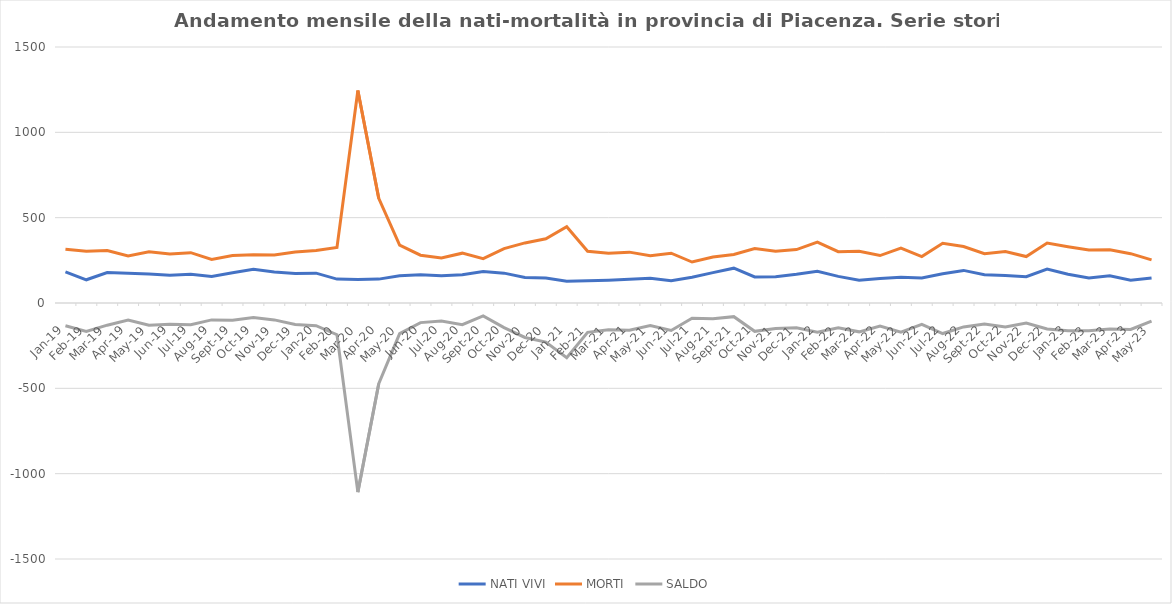
| Category | NATI VIVI | MORTI | SALDO |
|---|---|---|---|
| 2019-01-01 | 182 | 315 | -133 |
| 2019-02-01 | 136 | 303 | -167 |
| 2019-03-01 | 178 | 308 | -130 |
| 2019-04-01 | 175 | 275 | -100 |
| 2019-05-01 | 170 | 300 | -130 |
| 2019-06-01 | 163 | 287 | -124 |
| 2019-07-01 | 168 | 295 | -127 |
| 2019-08-01 | 156 | 255 | -99 |
| 2019-09-01 | 177 | 278 | -101 |
| 2019-10-01 | 198 | 283 | -85 |
| 2019-11-01 | 182 | 281 | -99 |
| 2019-12-01 | 173 | 299 | -126 |
| 2020-01-01 | 175 | 308 | -133 |
| 2020-02-01 | 140 | 326 | -186 |
| 2020-03-01 | 137 | 1245 | -1108 |
| 2020-04-01 | 140 | 613 | -473 |
| 2020-05-01 | 160 | 339 | -179 |
| 2020-06-01 | 165 | 280 | -115 |
| 2020-07-01 | 159 | 264 | -105 |
| 2020-08-01 | 165 | 292 | -127 |
| 2020-09-01 | 184 | 260 | -76 |
| 2020-10-01 | 175 | 319 | -144 |
| 2020-11-01 | 150 | 352 | -202 |
| 2020-12-01 | 147 | 376 | -229 |
| 2021-01-01 | 127 | 447 | -320 |
| 2021-02-01 | 131 | 303 | -172 |
| 2021-03-01 | 134 | 291 | -157 |
| 2021-04-01 | 139 | 298 | -159 |
| 2021-05-01 | 145 | 277 | -132 |
| 2021-06-01 | 131 | 292 | -161 |
| 2021-07-01 | 151 | 240 | -89 |
| 2021-08-01 | 178 | 270 | -92 |
| 2021-09-01 | 204 | 284 | -80 |
| 2021-10-01 | 153 | 319 | -166 |
| 2021-11-01 | 154 | 303 | -149 |
| 2021-12-01 | 168 | 313 | -145 |
| 2022-01-01 | 186 | 357 | -171 |
| 2022-02-01 | 156 | 301 | -145 |
| 2022-03-01 | 134 | 303 | -169 |
| 2022-04-01 | 143 | 278 | -135 |
| 2022-05-01 | 151 | 322 | -171 |
| 2022-06-01 | 147 | 272 | -125 |
| 2022-07-01 | 171 | 350 | -179 |
| 2022-08-01 | 191 | 331 | -140 |
| 2022-09-01 | 166 | 289 | -123 |
| 2022-10-01 | 161 | 302 | -141 |
| 2022-11-01 | 154 | 272 | -118 |
| 2022-12-01 | 199 | 351 | -152 |
| 2023-01-01 | 168 | 330 | -162 |
| 2023-02-01 | 147 | 310 | -163 |
| 2023-03-01 | 160 | 312 | -152 |
| 2023-04-01 | 134 | 289 | -155 |
| 2023-05-01 | 147 | 253 | -106 |